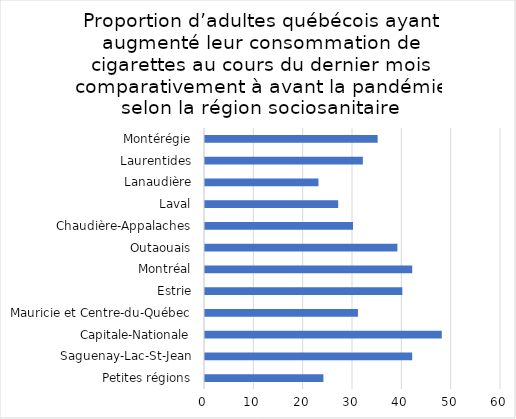
| Category | Series 0 |
|---|---|
| Petites régions | 24 |
| Saguenay-Lac-St-Jean | 42 |
| Capitale-Nationale | 48 |
| Mauricie et Centre-du-Québec | 31 |
| Estrie | 40 |
| Montréal | 42 |
| Outaouais | 39 |
| Chaudière-Appalaches | 30 |
| Laval | 27 |
| Lanaudière | 23 |
| Laurentides | 32 |
| Montérégie | 35 |